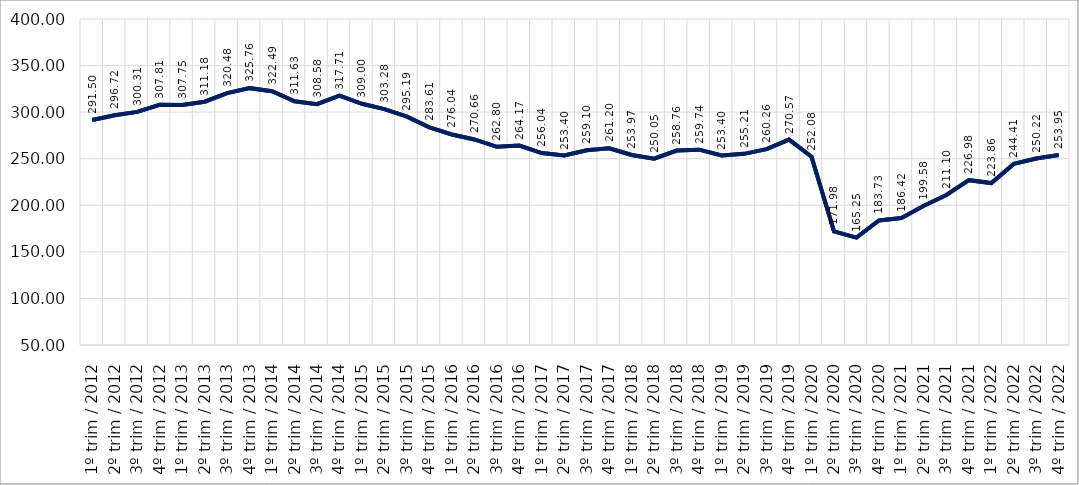
| Category | 40% mais pobres |
|---|---|
| 1º trim / 2012 | 291.497 |
| 2º trim / 2012 | 296.719 |
| 3º trim / 2012 | 300.309 |
| 4º trim / 2012 | 307.805 |
| 1º trim / 2013 | 307.746 |
| 2º trim / 2013 | 311.182 |
| 3º trim / 2013 | 320.479 |
| 4º trim / 2013 | 325.76 |
| 1º trim / 2014 | 322.493 |
| 2º trim / 2014 | 311.628 |
| 3º trim / 2014 | 308.581 |
| 4º trim / 2014 | 317.713 |
| 1º trim / 2015 | 308.999 |
| 2º trim / 2015 | 303.285 |
| 3º trim / 2015 | 295.189 |
| 4º trim / 2015 | 283.606 |
| 1º trim / 2016 | 276.041 |
| 2º trim / 2016 | 270.66 |
| 3º trim / 2016 | 262.8 |
| 4º trim / 2016 | 264.174 |
| 1º trim / 2017 | 256.041 |
| 2º trim / 2017 | 253.403 |
| 3º trim / 2017 | 259.101 |
| 4º trim / 2017 | 261.195 |
| 1º trim / 2018 | 253.971 |
| 2º trim / 2018 | 250.053 |
| 3º trim / 2018 | 258.759 |
| 4º trim / 2018 | 259.736 |
| 1º trim / 2019 | 253.397 |
| 2º trim / 2019 | 255.212 |
| 3º trim / 2019 | 260.259 |
| 4º trim / 2019 | 270.57 |
| 1º trim / 2020 | 252.084 |
| 2º trim / 2020 | 171.977 |
| 3º trim / 2020 | 165.254 |
| 4º trim / 2020 | 183.73 |
| 1º trim / 2021 | 186.42 |
| 2º trim / 2021 | 199.577 |
| 3º trim / 2021 | 211.096 |
| 4º trim / 2021 | 226.976 |
| 1º trim / 2022 | 223.861 |
| 2º trim / 2022 | 244.407 |
| 3º trim / 2022 | 250.223 |
| 4º trim / 2022 | 253.948 |